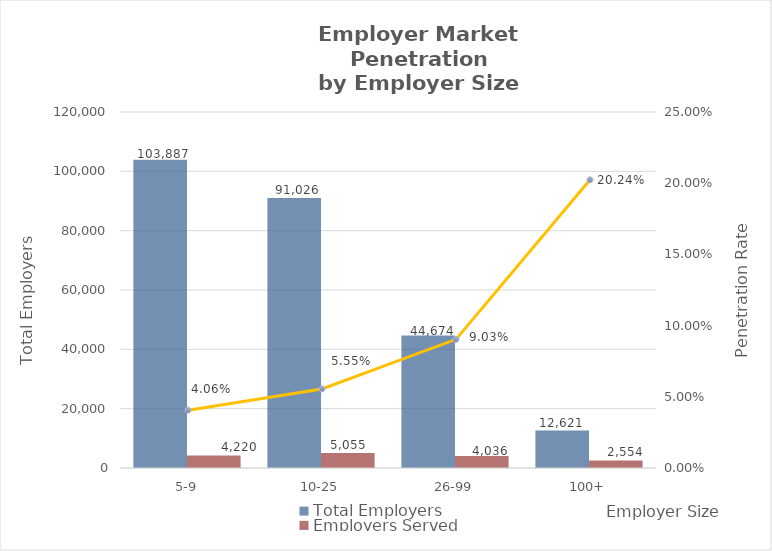
| Category | Total Employers | Employers Served |
|---|---|---|
| 5-9 | 103887 | 4220 |
| 10-25 | 91026 | 5055 |
| 26-99 | 44674 | 4036 |
| 100+ | 12621 | 2554 |